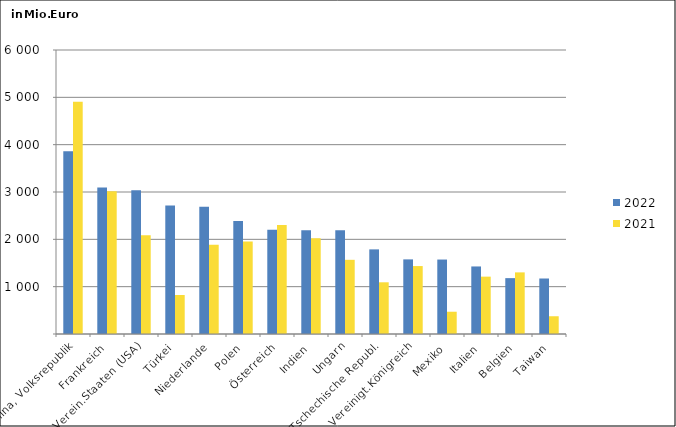
| Category | 2022 | 2021 |
|---|---|---|
| China, Volksrepublik | 3860.392 | 4908.209 |
| Frankreich | 3097.563 | 3018.386 |
| Verein.Staaten (USA) | 3035.846 | 2086.828 |
| Türkei | 2714.051 | 823.53 |
| Niederlande | 2686.485 | 1885.531 |
| Polen | 2388.794 | 1953.742 |
| Österreich | 2200.818 | 2303.749 |
| Indien | 2189.637 | 2023.298 |
| Ungarn | 2189.49 | 1567.252 |
| Tschechische Republ. | 1787.739 | 1092.372 |
| Vereinigt.Königreich | 1576.404 | 1435.305 |
| Mexiko | 1573.004 | 470.571 |
| Italien | 1427.056 | 1211.678 |
| Belgien | 1180.32 | 1301.753 |
| Taiwan | 1172.569 | 375.22 |